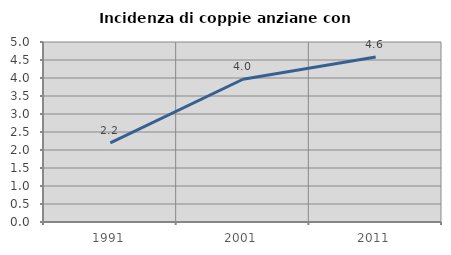
| Category | Incidenza di coppie anziane con figli |
|---|---|
| 1991.0 | 2.198 |
| 2001.0 | 3.965 |
| 2011.0 | 4.581 |